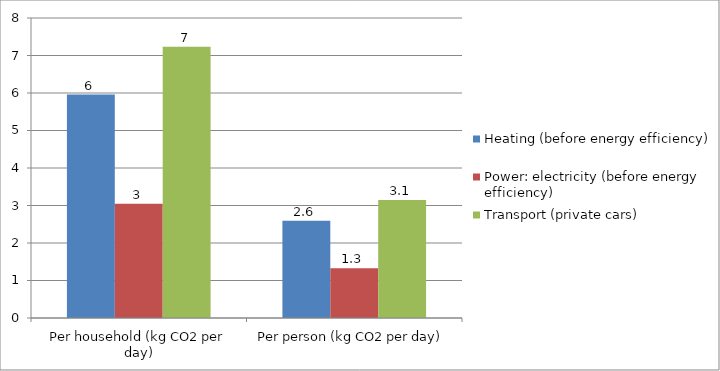
| Category | Heating (before energy efficiency) | Power: electricity (before energy efficiency) | Transport (private cars) |
|---|---|---|---|
| Per household (kg CO2 per day) | 5.96 | 3.047 | 7.233 |
| Per person (kg CO2 per day) | 2.591 | 1.325 | 3.145 |